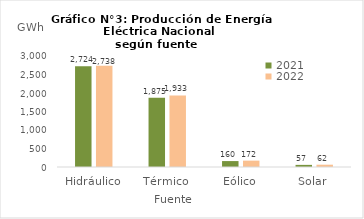
| Category | 2021 | 2022 |
|---|---|---|
| Hidráulico | 2723.622 | 2738.25 |
| Térmico | 1874.976 | 1933.077 |
| Eólico | 160.206 | 171.865 |
| Solar | 57.149 | 62.219 |